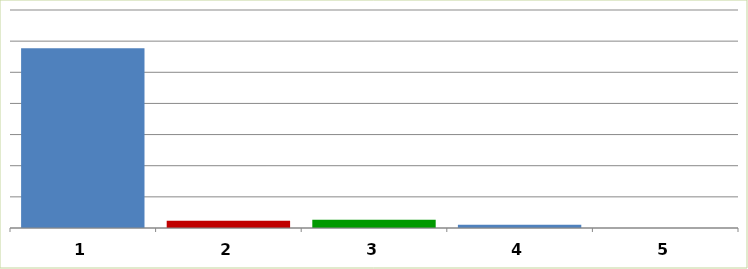
| Category | Series 0 |
|---|---|
| 0 | 57753744.135 |
| 1 | 2319574 |
| 2 | 2650000 |
| 3 | 1060000 |
| 4 | 0 |